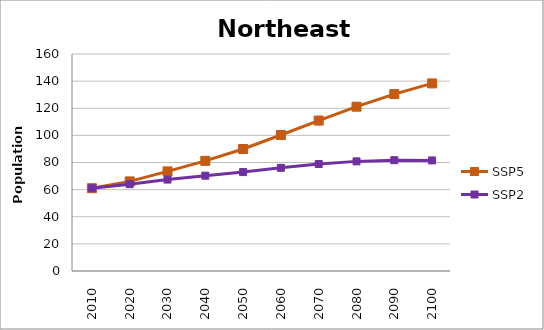
| Category | SSP5 | SSP2 |
|---|---|---|
| 2010.0 | 61044845 | 61044845 |
| 2020.0 | 66070459 | 64028981 |
| 2030.0 | 73444360 | 67414211 |
| 2040.0 | 81229211 | 70283993 |
| 2050.0 | 89936290 | 72943607 |
| 2060.0 | 100287850 | 76066450 |
| 2070.0 | 110913015 | 78897664 |
| 2080.0 | 121157727 | 80827347 |
| 2090.0 | 130428125 | 81697443 |
| 2100.0 | 138313469 | 81534807 |